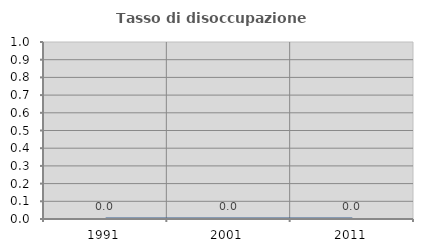
| Category | Tasso di disoccupazione giovanile  |
|---|---|
| 1991.0 | 0 |
| 2001.0 | 0 |
| 2011.0 | 0 |